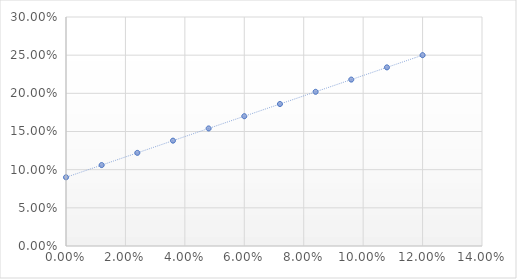
| Category | Retorno |
|---|---|
| 0.0 | 0.09 |
| 0.012000533321482 | 0.106 |
| 0.024001066642964 | 0.122 |
| 0.03600159996444601 | 0.138 |
| 0.04800213328592801 | 0.154 |
| 0.060002666607410014 | 0.17 |
| 0.07200319992889201 | 0.186 |
| 0.08400373325037401 | 0.202 |
| 0.09600426657185603 | 0.218 |
| 0.10800479989333803 | 0.234 |
| 0.12000533321482003 | 0.25 |